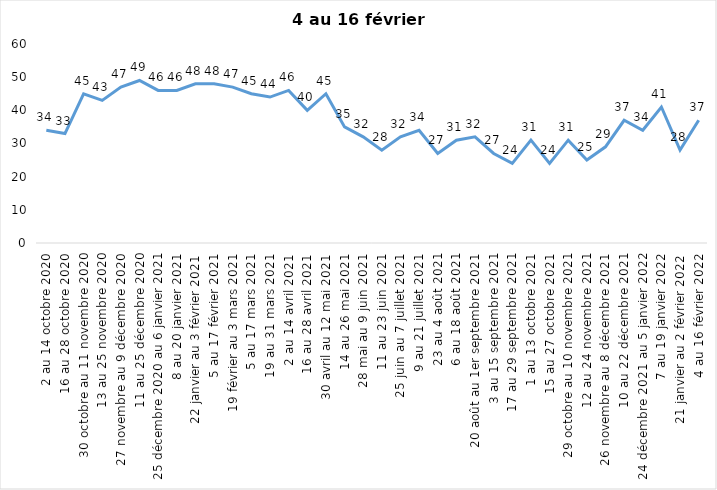
| Category | Toujours aux trois mesures |
|---|---|
| 2 au 14 octobre 2020 | 34 |
| 16 au 28 octobre 2020 | 33 |
| 30 octobre au 11 novembre 2020 | 45 |
| 13 au 25 novembre 2020 | 43 |
| 27 novembre au 9 décembre 2020 | 47 |
| 11 au 25 décembre 2020 | 49 |
| 25 décembre 2020 au 6 janvier 2021 | 46 |
| 8 au 20 janvier 2021 | 46 |
| 22 janvier au 3 février 2021 | 48 |
| 5 au 17 février 2021 | 48 |
| 19 février au 3 mars 2021 | 47 |
| 5 au 17 mars 2021 | 45 |
| 19 au 31 mars 2021 | 44 |
| 2 au 14 avril 2021 | 46 |
| 16 au 28 avril 2021 | 40 |
| 30 avril au 12 mai 2021 | 45 |
| 14 au 26 mai 2021 | 35 |
| 28 mai au 9 juin 2021 | 32 |
| 11 au 23 juin 2021 | 28 |
| 25 juin au 7 juillet 2021 | 32 |
| 9 au 21 juillet 2021 | 34 |
| 23 au 4 août 2021 | 27 |
| 6 au 18 août 2021 | 31 |
| 20 août au 1er septembre 2021 | 32 |
| 3 au 15 septembre 2021 | 27 |
| 17 au 29 septembre 2021 | 24 |
| 1 au 13 octobre 2021 | 31 |
| 15 au 27 octobre 2021 | 24 |
| 29 octobre au 10 novembre 2021 | 31 |
| 12 au 24 novembre 2021 | 25 |
| 26 novembre au 8 décembre 2021 | 29 |
| 10 au 22 décembre 2021 | 37 |
| 24 décembre 2021 au 5 janvier 2022 | 34 |
| 7 au 19 janvier 2022 | 41 |
| 21 janvier au 2 février 2022 | 28 |
| 4 au 16 février 2022 | 37 |